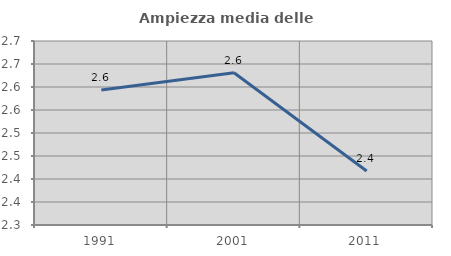
| Category | Ampiezza media delle famiglie |
|---|---|
| 1991.0 | 2.594 |
| 2001.0 | 2.631 |
| 2011.0 | 2.417 |